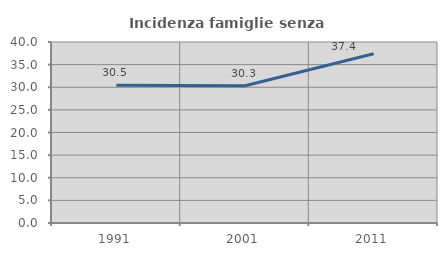
| Category | Incidenza famiglie senza nuclei |
|---|---|
| 1991.0 | 30.467 |
| 2001.0 | 30.32 |
| 2011.0 | 37.39 |